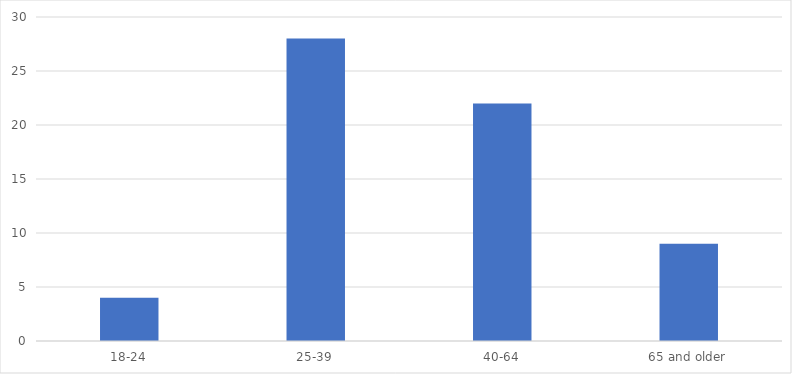
| Category | Number of Responses |
|---|---|
| 18-24 | 4 |
| 25-39 | 28 |
| 40-64 | 22 |
| 65 and older | 9 |